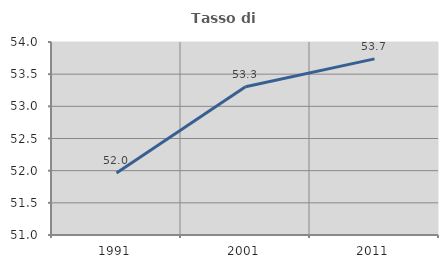
| Category | Tasso di occupazione   |
|---|---|
| 1991.0 | 51.964 |
| 2001.0 | 53.304 |
| 2011.0 | 53.738 |